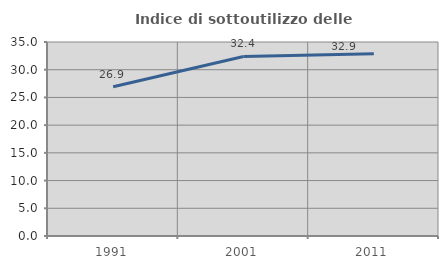
| Category | Indice di sottoutilizzo delle abitazioni  |
|---|---|
| 1991.0 | 26.923 |
| 2001.0 | 32.393 |
| 2011.0 | 32.879 |